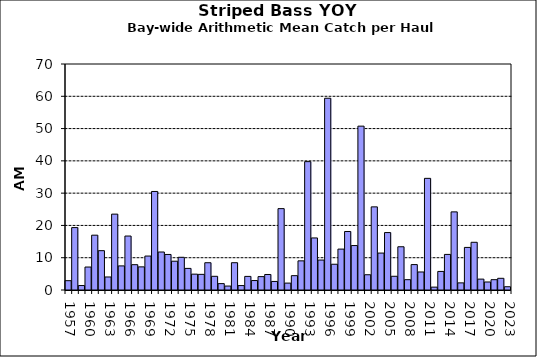
| Category | Series 0 |
|---|---|
| 1957.0 | 2.886 |
| 1958.0 | 19.333 |
| 1959.0 | 1.382 |
| 1960.0 | 7.111 |
| 1961.0 | 16.978 |
| 1962.0 | 12.182 |
| 1963.0 | 4.034 |
| 1964.0 | 23.5 |
| 1965.0 | 7.466 |
| 1966.0 | 16.712 |
| 1967.0 | 7.841 |
| 1968.0 | 7.167 |
| 1969.0 | 10.515 |
| 1970.0 | 30.523 |
| 1971.0 | 11.765 |
| 1972.0 | 11.008 |
| 1973.0 | 8.917 |
| 1974.0 | 10.131 |
| 1975.0 | 6.689 |
| 1976.0 | 4.909 |
| 1977.0 | 4.848 |
| 1978.0 | 8.447 |
| 1979.0 | 4.242 |
| 1980.0 | 1.977 |
| 1981.0 | 1.22 |
| 1982.0 | 8.455 |
| 1983.0 | 1.371 |
| 1984.0 | 4.212 |
| 1985.0 | 2.932 |
| 1986.0 | 4.144 |
| 1987.0 | 4.803 |
| 1988.0 | 2.652 |
| 1989.0 | 25.205 |
| 1990.0 | 2.136 |
| 1991.0 | 4.439 |
| 1992.0 | 9.03 |
| 1993.0 | 39.758 |
| 1994.0 | 16.121 |
| 1995.0 | 9.273 |
| 1996.0 | 59.394 |
| 1997.0 | 7.977 |
| 1998.0 | 12.667 |
| 1999.0 | 18.121 |
| 2000.0 | 13.765 |
| 2001.0 | 50.75 |
| 2002.0 | 4.727 |
| 2003.0 | 25.75 |
| 2004.0 | 11.44 |
| 2005.0 | 17.788 |
| 2006.0 | 4.25 |
| 2007.0 | 13.394 |
| 2008.0 | 3.197 |
| 2009.0 | 7.871 |
| 2010.0 | 5.583 |
| 2011.0 | 34.583 |
| 2012.0 | 0.886 |
| 2013.0 | 5.75 |
| 2014.0 | 11.02 |
| 2015.0 | 24.197 |
| 2016.0 | 2.205 |
| 2017.0 | 13.189 |
| 2018.0 | 14.78 |
| 2019.0 | 3.37 |
| 2020.0 | 2.48 |
| 2021.0 | 3.196 |
| 2022.0 | 3.621 |
| 2023.0 | 1.015 |